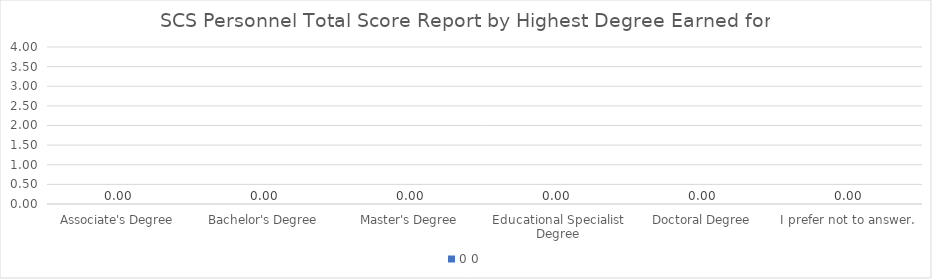
| Category | 0 |
|---|---|
| Associate's Degree | 0 |
| Bachelor's Degree | 0 |
| Master's Degree | 0 |
| Educational Specialist Degree | 0 |
| Doctoral Degree | 0 |
| I prefer not to answer. | 0 |